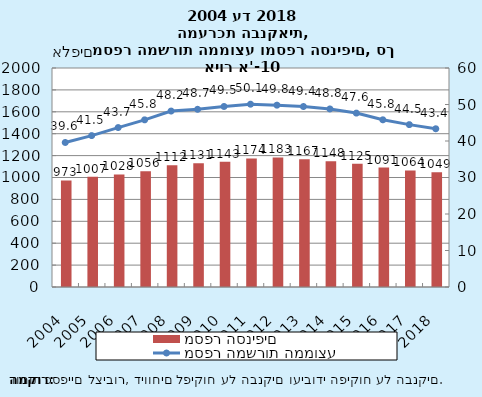
| Category | מספר הסניפים |
|---|---|
| 2004-12-31 | 973 |
| 2005-12-31 | 1007 |
| 2006-12-31 | 1028 |
| 2007-12-31 | 1056 |
| 2008-12-31 | 1112 |
| 2009-12-31 | 1131 |
| 2010-12-31 | 1143 |
| 2011-12-31 | 1174 |
| 2012-12-31 | 1183 |
| 2013-12-31 | 1167 |
| 2014-12-31 | 1148 |
| 2015-12-31 | 1125 |
| 2016-12-31 | 1091 |
| 2017-12-31 | 1064 |
| 2018-12-31 | 1049 |